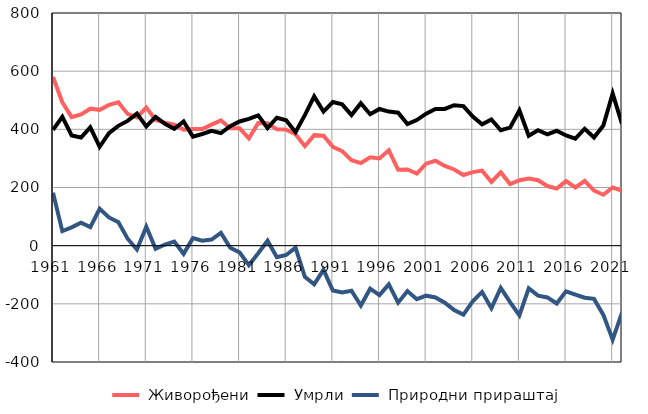
| Category |  Живорођени |  Умрли |  Природни прираштај |
|---|---|---|---|
| 1961.0 | 580 | 398 | 182 |
| 1962.0 | 493 | 443 | 50 |
| 1963.0 | 442 | 379 | 63 |
| 1964.0 | 451 | 372 | 79 |
| 1965.0 | 471 | 407 | 64 |
| 1966.0 | 467 | 340 | 127 |
| 1967.0 | 484 | 387 | 97 |
| 1968.0 | 493 | 412 | 81 |
| 1969.0 | 453 | 429 | 24 |
| 1970.0 | 441 | 454 | -13 |
| 1971.0 | 475 | 410 | 65 |
| 1972.0 | 432 | 443 | -11 |
| 1973.0 | 423 | 419 | 4 |
| 1974.0 | 416 | 402 | 14 |
| 1975.0 | 399 | 427 | -28 |
| 1976.0 | 401 | 375 | 26 |
| 1977.0 | 401 | 384 | 17 |
| 1978.0 | 416 | 395 | 21 |
| 1979.0 | 431 | 387 | 44 |
| 1980.0 | 404 | 411 | -7 |
| 1981.0 | 404 | 427 | -23 |
| 1982.0 | 369 | 436 | -67 |
| 1983.0 | 422 | 448 | -26 |
| 1984.0 | 421 | 404 | 17 |
| 1985.0 | 400 | 440 | -40 |
| 1986.0 | 399 | 431 | -32 |
| 1987.0 | 383 | 390 | -7 |
| 1988.0 | 342 | 449 | -107 |
| 1989.0 | 380 | 513 | -133 |
| 1990.0 | 378 | 461 | -83 |
| 1991.0 | 340 | 494 | -154 |
| 1992.0 | 325 | 486 | -161 |
| 1993.0 | 294 | 449 | -155 |
| 1994.0 | 284 | 490 | -206 |
| 1995.0 | 304 | 452 | -148 |
| 1996.0 | 300 | 470 | -170 |
| 1997.0 | 328 | 461 | -133 |
| 1998.0 | 261 | 457 | -196 |
| 1999.0 | 262 | 418 | -156 |
| 2000.0 | 248 | 432 | -184 |
| 2001.0 | 282 | 454 | -172 |
| 2002.0 | 292 | 470 | -178 |
| 2003.0 | 274 | 470 | -196 |
| 2004.0 | 262 | 483 | -221 |
| 2005.0 | 243 | 480 | -237 |
| 2006.0 | 253 | 444 | -191 |
| 2007.0 | 258 | 417 | -159 |
| 2008.0 | 219 | 434 | -215 |
| 2009.0 | 252 | 397 | -145 |
| 2010.0 | 212 | 406 | -194 |
| 2011.0 | 225 | 465 | -240 |
| 2012.0 | 231 | 378 | -147 |
| 2013.0 | 225 | 397 | -172 |
| 2014.0 | 205 | 383 | -178 |
| 2015.0 | 196 | 395 | -199 |
| 2016.0 | 222 | 379 | -157 |
| 2017.0 | 200 | 368 | -168 |
| 2018.0 | 223 | 402 | -179 |
| 2019.0 | 189 | 372 | -183 |
| 2020.0 | 175 | 413 | -238 |
| 2021.0 | 200 | 523 | -323 |
| 2022.0 | 189 | 419 | -230 |